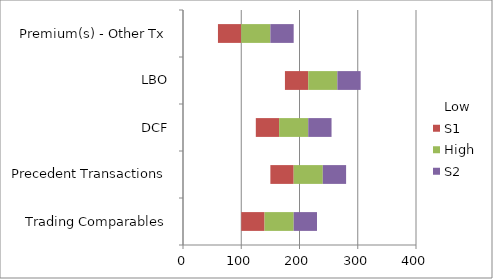
| Category | Low | S1 | High | S2 |
|---|---|---|---|---|
| Trading Comparables | 100 | 40 | 50 | 40 |
| Precedent Transactions | 150 | 40 | 50 | 40 |
| DCF | 125 | 40 | 50 | 40 |
| LBO | 175 | 40 | 50 | 40 |
| Premium(s) - Other Tx | 60 | 40 | 50 | 40 |